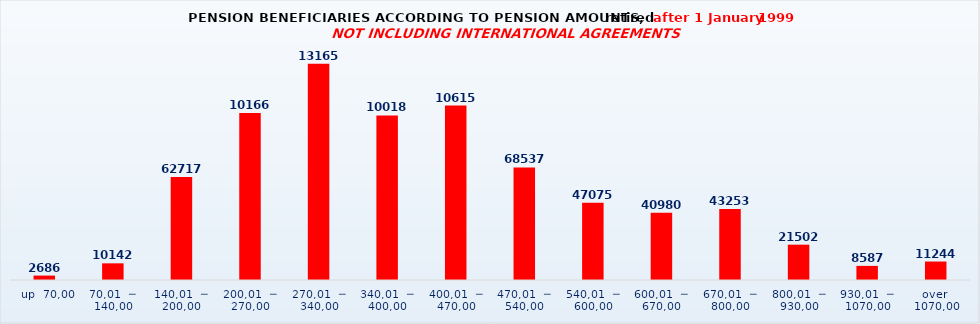
| Category | Series 0 |
|---|---|
|   up  70,00 | 2686 |
| 70,01  ─  140,00 | 10142 |
| 140,01  ─  200,00 | 62717 |
| 200,01  ─  270,00 | 101660 |
| 270,01  ─  340,00 | 131658 |
| 340,01  ─  400,00 | 100186 |
| 400,01  ─  470,00 | 106156 |
| 470,01  ─  540,00 | 68537 |
| 540,01  ─  600,00 | 47075 |
| 600,01  ─  670,00 | 40980 |
| 670,01  ─  800,00 | 43253 |
| 800,01  ─  930,00 | 21502 |
| 930,01  ─  1070,00 | 8587 |
| over  1070,00 | 11244 |